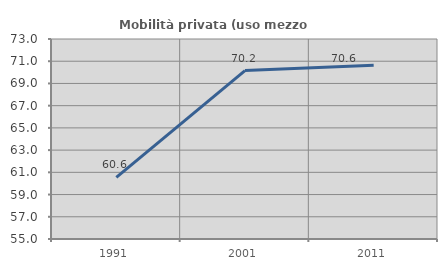
| Category | Mobilità privata (uso mezzo privato) |
|---|---|
| 1991.0 | 60.552 |
| 2001.0 | 70.162 |
| 2011.0 | 70.644 |